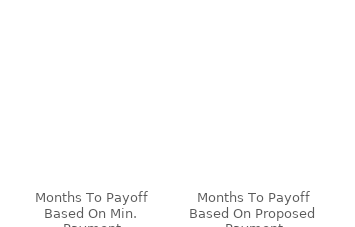
| Category | Series 0 |
|---|---|
| Months To Payoff Based On Min. Payment | 0 |
| Months To Payoff Based On Proposed Payment | 0 |